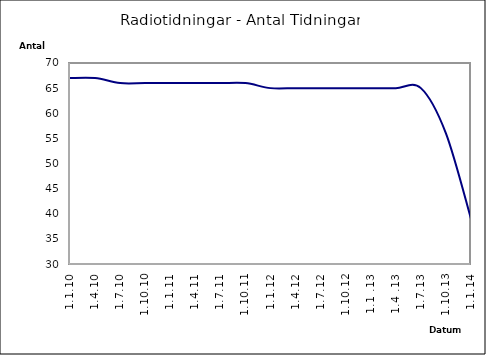
| Category | Series 0 |
|---|---|
| 1.1.10 | 67 |
| 1.4.10 | 67 |
| 1.7.10 | 66 |
| 1.10.10 | 66 |
| 1.1.11 | 66 |
| 1.4.11 | 66 |
| 1.7.11 | 66 |
| 1.10.11 | 66 |
| 1.1.12 | 65 |
| 1.4.12 | 65 |
| 1.7.12 | 65 |
| 1.10.12 | 65 |
| 1.1 .13 | 65 |
| 1.4 .13 | 65 |
| 1.7.13 | 65 |
| 1.10.13 | 56 |
| 1.1.14 | 39 |